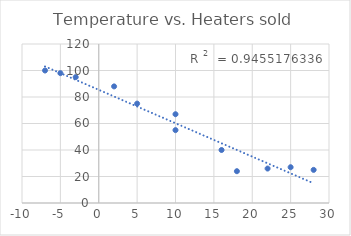
| Category | Series 0 |
|---|---|
| -5.0 | 98 |
| -7.0 | 100 |
| 5.0 | 75 |
| 10.0 | 67 |
| 18.0 | 24 |
| 22.0 | 26 |
| 28.0 | 25 |
| 25.0 | 27 |
| 16.0 | 40 |
| 10.0 | 55 |
| 2.0 | 88 |
| -3.0 | 95 |